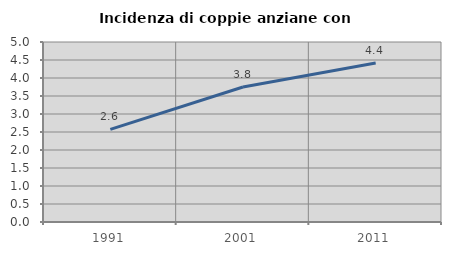
| Category | Incidenza di coppie anziane con figli |
|---|---|
| 1991.0 | 2.573 |
| 2001.0 | 3.751 |
| 2011.0 | 4.417 |